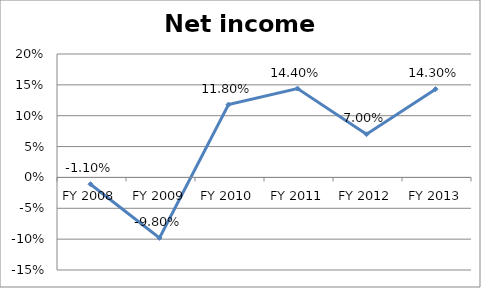
| Category | Net income ratio |
|---|---|
| FY 2013 | 0.143 |
| FY 2012 | 0.07 |
| FY 2011 | 0.144 |
| FY 2010 | 0.118 |
| FY 2009 | -0.098 |
| FY 2008 | -0.011 |